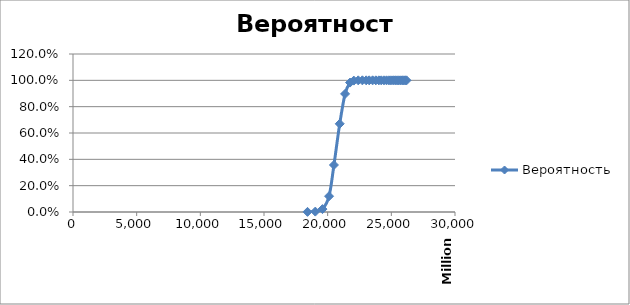
| Category | Вероятность |
|---|---|
| 18418105146.0 | 0.001 |
| 19029026541.0 | 0.003 |
| 19590923697.0 | 0.022 |
| 20108828356.0 | 0.12 |
| 20492822336.0 | 0.357 |
| 20947161394.0 | 0.67 |
| 21367892879.0 | 0.897 |
| 21758223778.0 | 0.983 |
| 22055207813.0 | 0.998 |
| 22401438724.0 | 1 |
| 22723888659.0 | 1 |
| 23024686015.0 | 1 |
| 23261097691.0 | 1 |
| 23530170925.0 | 1 |
| 23781987696.0 | 1 |
| 24017987153.0 | 1 |
| 24210348438.0 | 1 |
| 24422846806.0 | 1 |
| 24622509539.0 | 1 |
| 24810314557.0 | 1 |
| 24969567370.0 | 1 |
| 25139478522.0 | 1 |
| 25299567952.0 | 1 |
| 25450493139.0 | 1 |
| 25584201776.0 | 1 |
| 25721102147.0 | 1 |
| 25850213486.0 | 1 |
| 25971960283.0 | 1 |
| 26085529346.0 | 1 |
| 26195907445.0 | 1 |